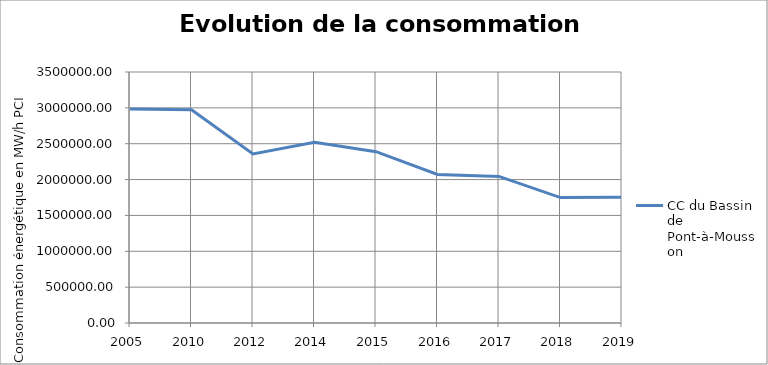
| Category | CC du Bassin de Pont-à-Mousson |
|---|---|
| 2005.0 | 2984238.374 |
| 2010.0 | 2972381.185 |
| 2012.0 | 2357186.66 |
| 2014.0 | 2520285.281 |
| 2015.0 | 2389434.553 |
| 2016.0 | 2070390.973 |
| 2017.0 | 2043598.091 |
| 2018.0 | 1748981.989 |
| 2019.0 | 1753278.504 |